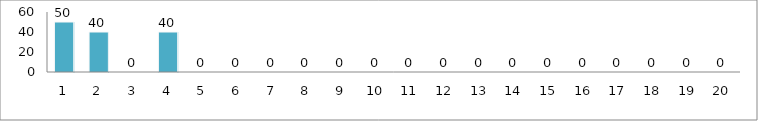
| Category | Series 0 |
|---|---|
| 0 | 50 |
| 1 | 40 |
| 2 | 0 |
| 3 | 40 |
| 4 | 0 |
| 5 | 0 |
| 6 | 0 |
| 7 | 0 |
| 8 | 0 |
| 9 | 0 |
| 10 | 0 |
| 11 | 0 |
| 12 | 0 |
| 13 | 0 |
| 14 | 0 |
| 15 | 0 |
| 16 | 0 |
| 17 | 0 |
| 18 | 0 |
| 19 | 0 |